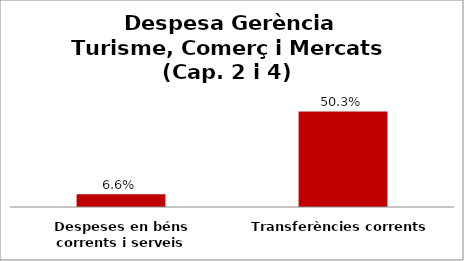
| Category | Series 0 |
|---|---|
| Despeses en béns corrents i serveis | 0.066 |
| Transferències corrents | 0.503 |